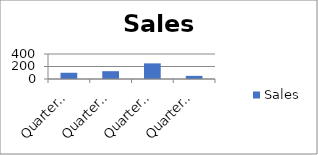
| Category | Sales |
|---|---|
| Quarter 1 | 100 |
| Quarter 2 | 125 |
| Quarter 3 | 250 |
| Quarter 4 | 50 |